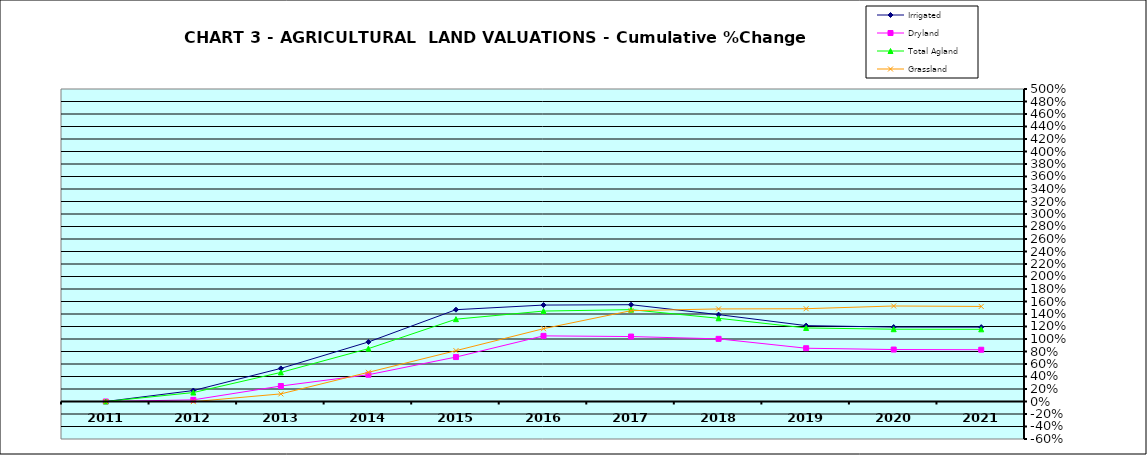
| Category | Irrigated | Dryland | Total Agland | Grassland |
|---|---|---|---|---|
| 2011.0 | 0 | 0 | 0 | 0 |
| 2012.0 | 0.175 | 0.026 | 0.143 | -0.002 |
| 2013.0 | 0.53 | 0.248 | 0.465 | 0.122 |
| 2014.0 | 0.952 | 0.428 | 0.846 | 0.467 |
| 2015.0 | 1.469 | 0.711 | 1.317 | 0.814 |
| 2016.0 | 1.543 | 1.05 | 1.447 | 1.165 |
| 2017.0 | 1.549 | 1.039 | 1.47 | 1.453 |
| 2018.0 | 1.39 | 1.002 | 1.331 | 1.481 |
| 2019.0 | 1.214 | 0.852 | 1.176 | 1.485 |
| 2020.0 | 1.191 | 0.831 | 1.157 | 1.528 |
| 2021.0 | 1.19 | 0.828 | 1.155 | 1.521 |